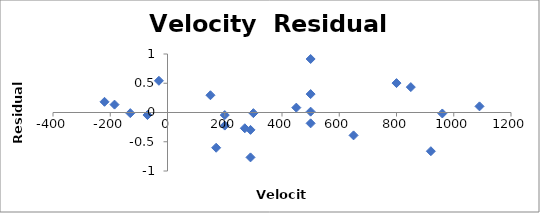
| Category | Series 0 |
|---|---|
| 170.0 | -0.602 |
| 290.0 | -0.767 |
| -130.0 | -0.011 |
| -70.0 | -0.043 |
| -185.0 | 0.135 |
| -220.0 | 0.183 |
| 200.0 | -0.224 |
| 290.0 | -0.297 |
| 270.0 | -0.27 |
| 200.0 | -0.044 |
| 300.0 | -0.011 |
| -30.0 | 0.542 |
| 650.0 | -0.391 |
| 150.0 | 0.295 |
| 500.0 | -0.185 |
| 920.0 | -0.662 |
| 450.0 | 0.083 |
| 500.0 | 0.015 |
| 500.0 | 0.315 |
| 960.0 | -0.017 |
| 500.0 | 0.915 |
| 850.0 | 0.434 |
| 800.0 | 0.503 |
| 1090.0 | 0.105 |